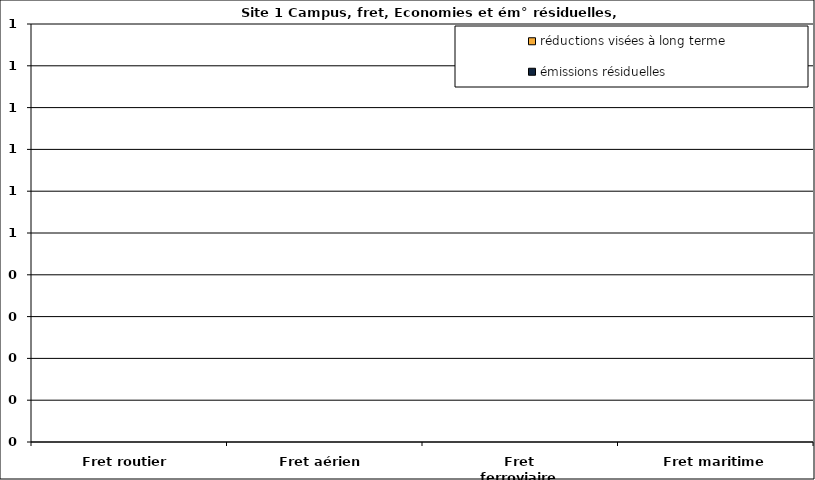
| Category | émissions résiduelles | réductions visées à long terme |
|---|---|---|
| Fret routier | 0 | 0 |
| Fret aérien | 0 | 0 |
| Fret ferroviaire | 0 | 0 |
| Fret maritime | 0 | 0 |